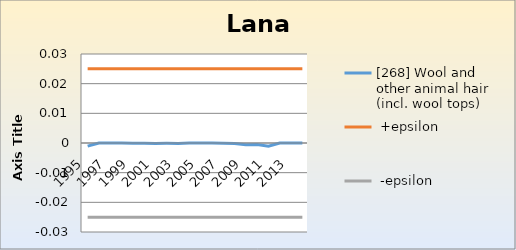
| Category | [268] Wool and other animal hair (incl. wool tops) |  +epsilon |  -epsilon |
|---|---|---|---|
| 1995.0 | -0.001 | 0.025 | -0.025 |
| 1996.0 | 0 | 0.025 | -0.025 |
| 1997.0 | 0 | 0.025 | -0.025 |
| 1998.0 | 0 | 0.025 | -0.025 |
| 1999.0 | 0 | 0.025 | -0.025 |
| 2000.0 | 0 | 0.025 | -0.025 |
| 2001.0 | 0 | 0.025 | -0.025 |
| 2002.0 | 0 | 0.025 | -0.025 |
| 2003.0 | 0 | 0.025 | -0.025 |
| 2004.0 | 0 | 0.025 | -0.025 |
| 2005.0 | 0 | 0.025 | -0.025 |
| 2006.0 | 0 | 0.025 | -0.025 |
| 2007.0 | 0 | 0.025 | -0.025 |
| 2008.0 | 0 | 0.025 | -0.025 |
| 2009.0 | -0.001 | 0.025 | -0.025 |
| 2010.0 | -0.001 | 0.025 | -0.025 |
| 2011.0 | -0.001 | 0.025 | -0.025 |
| 2012.0 | 0 | 0.025 | -0.025 |
| 2013.0 | 0 | 0.025 | -0.025 |
| 2014.0 | 0 | 0.025 | -0.025 |